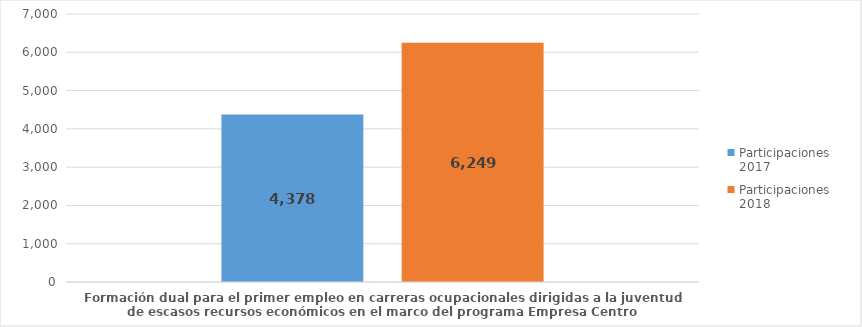
| Category | Participaciones 2017 | Participaciones 
2018 |
|---|---|---|
| Formación dual para el primer empleo en carreras ocupacionales dirigidas a la juventud de escasos recursos económicos en el marco del programa Empresa Centro | 4378 | 6249 |